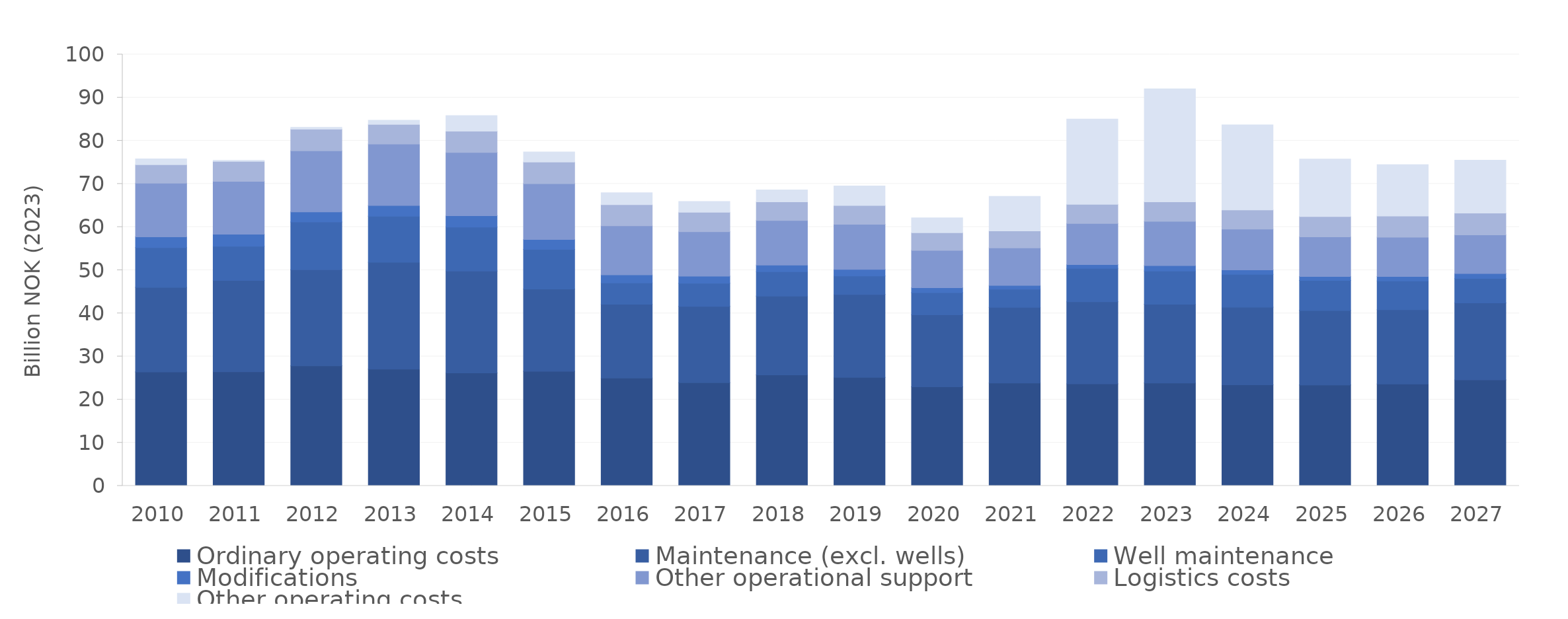
| Category | Ordinary operating costs | Maintenance (excl. wells) | Well maintenance | Modifications  | Other operational support  | Logistics costs | Other operating costs |
|---|---|---|---|---|---|---|---|
| 2010.0 | 26.425 | 19.582 | 9.241 | 2.495 | 12.422 | 4.295 | 1.326 |
| 2011.0 | 26.468 | 21.156 | 7.911 | 2.793 | 12.275 | 4.639 | 0.232 |
| 2012.0 | 27.815 | 22.281 | 11.098 | 2.312 | 14.192 | 4.986 | 0.45 |
| 2013.0 | 27.057 | 24.798 | 10.65 | 2.502 | 14.244 | 4.547 | 0.965 |
| 2014.0 | 26.192 | 23.623 | 10.194 | 2.616 | 14.689 | 4.927 | 3.598 |
| 2015.0 | 26.571 | 19.048 | 9.201 | 2.293 | 12.961 | 4.987 | 2.335 |
| 2016.0 | 25.019 | 17.098 | 4.947 | 1.853 | 11.377 | 4.9 | 2.746 |
| 2017.0 | 23.921 | 17.687 | 5.367 | 1.663 | 10.292 | 4.507 | 2.493 |
| 2018.0 | 25.713 | 18.292 | 5.633 | 1.545 | 10.325 | 4.324 | 2.792 |
| 2019.0 | 25.144 | 19.212 | 4.313 | 1.505 | 10.48 | 4.357 | 4.525 |
| 2020.0 | 22.96 | 16.693 | 5.128 | 1.154 | 8.668 | 4.088 | 3.443 |
| 2021.0 | 23.852 | 17.525 | 4.217 | 0.892 | 8.669 | 3.956 | 8.014 |
| 2022.0 | 23.662 | 19.016 | 7.758 | 0.884 | 9.517 | 4.439 | 19.758 |
| 2023.0 | 23.858 | 18.241 | 7.718 | 1.269 | 10.256 | 4.524 | 26.16 |
| 2024.0 | 23.422 | 18 | 7.634 | 1.014 | 9.474 | 4.435 | 19.7 |
| 2025.0 | 23.402 | 17.262 | 6.959 | 0.939 | 9.181 | 4.687 | 13.349 |
| 2026.0 | 23.633 | 17.206 | 6.663 | 1.054 | 9.117 | 4.877 | 11.902 |
| 2027.0 | 24.588 | 17.817 | 5.699 | 1.119 | 8.982 | 5.033 | 12.266 |